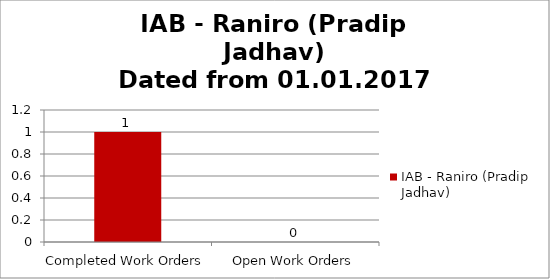
| Category | IAB - Raniro (Pradip Jadhav) |
|---|---|
| Completed Work Orders | 1 |
| Open Work Orders | 0 |